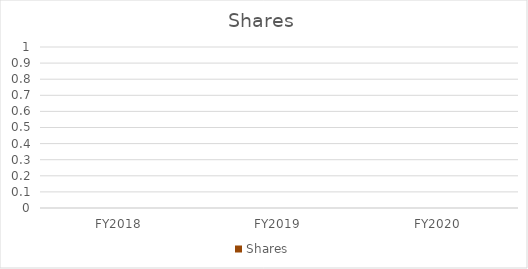
| Category | Shares |
|---|---|
| FY2018 | 0 |
| FY2019 | 0 |
| FY2020 | 0 |